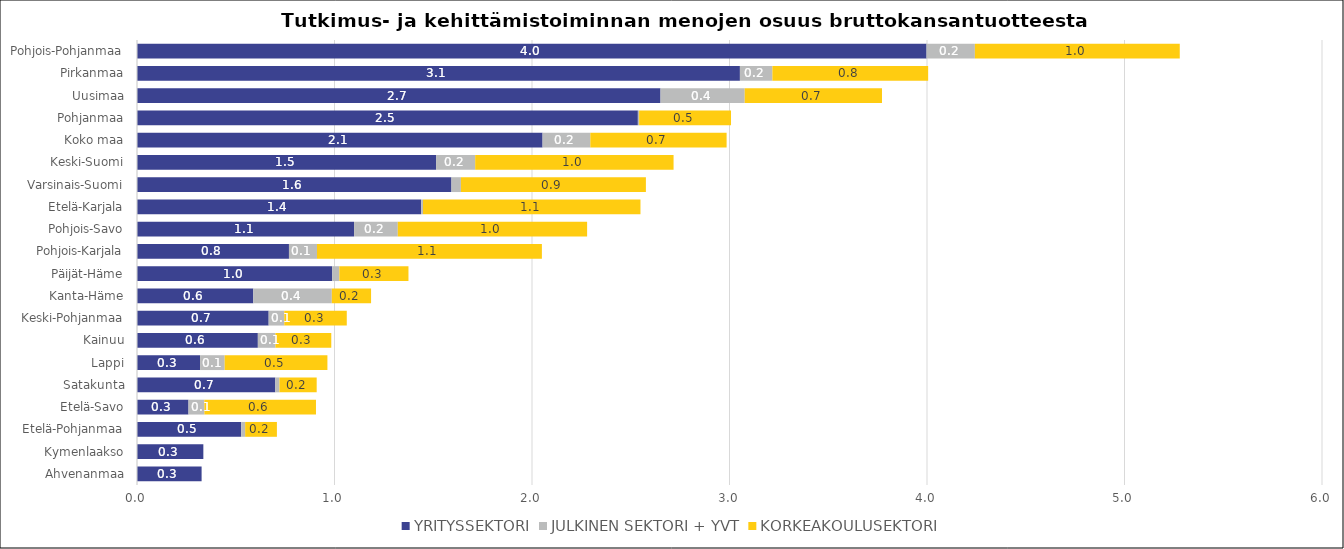
| Category | YRITYSSEKTORI | JULKINEN SEKTORI + YVT | KORKEAKOULUSEKTORI |
|---|---|---|---|
| Ahvenanmaa | 0.327 | 0 | 0 |
| Kymenlaakso | 0.336 | 0 | 0 |
| Etelä-Pohjanmaa | 0.528 | 0.02 | 0.161 |
| Etelä-Savo | 0.261 | 0.08 | 0.565 |
| Satakunta | 0.7 | 0.021 | 0.189 |
| Lappi | 0.319 | 0.124 | 0.52 |
| Kainuu | 0.612 | 0.089 | 0.283 |
| Keski-Pohjanmaa | 0.667 | 0.079 | 0.316 |
| Kanta-Häme | 0.589 | 0.398 | 0.199 |
| Päijät-Häme | 0.988 | 0.036 | 0.35 |
| Pohjois-Karjala | 0.769 | 0.142 | 1.139 |
| Pohjois-Savo | 1.099 | 0.221 | 0.959 |
| Etelä-Karjala | 1.439 | 0.009 | 1.101 |
| Varsinais-Suomi | 1.592 | 0.048 | 0.937 |
| Keski-Suomi | 1.514 | 0.198 | 1.004 |
| Koko maa | 2.053 | 0.242 | 0.69 |
| Pohjanmaa | 2.536 | 0.006 | 0.465 |
| Uusimaa | 2.651 | 0.426 | 0.695 |
| Pirkanmaa | 3.053 | 0.164 | 0.789 |
| Pohjois-Pohjanmaa | 3.998 | 0.245 | 1.037 |